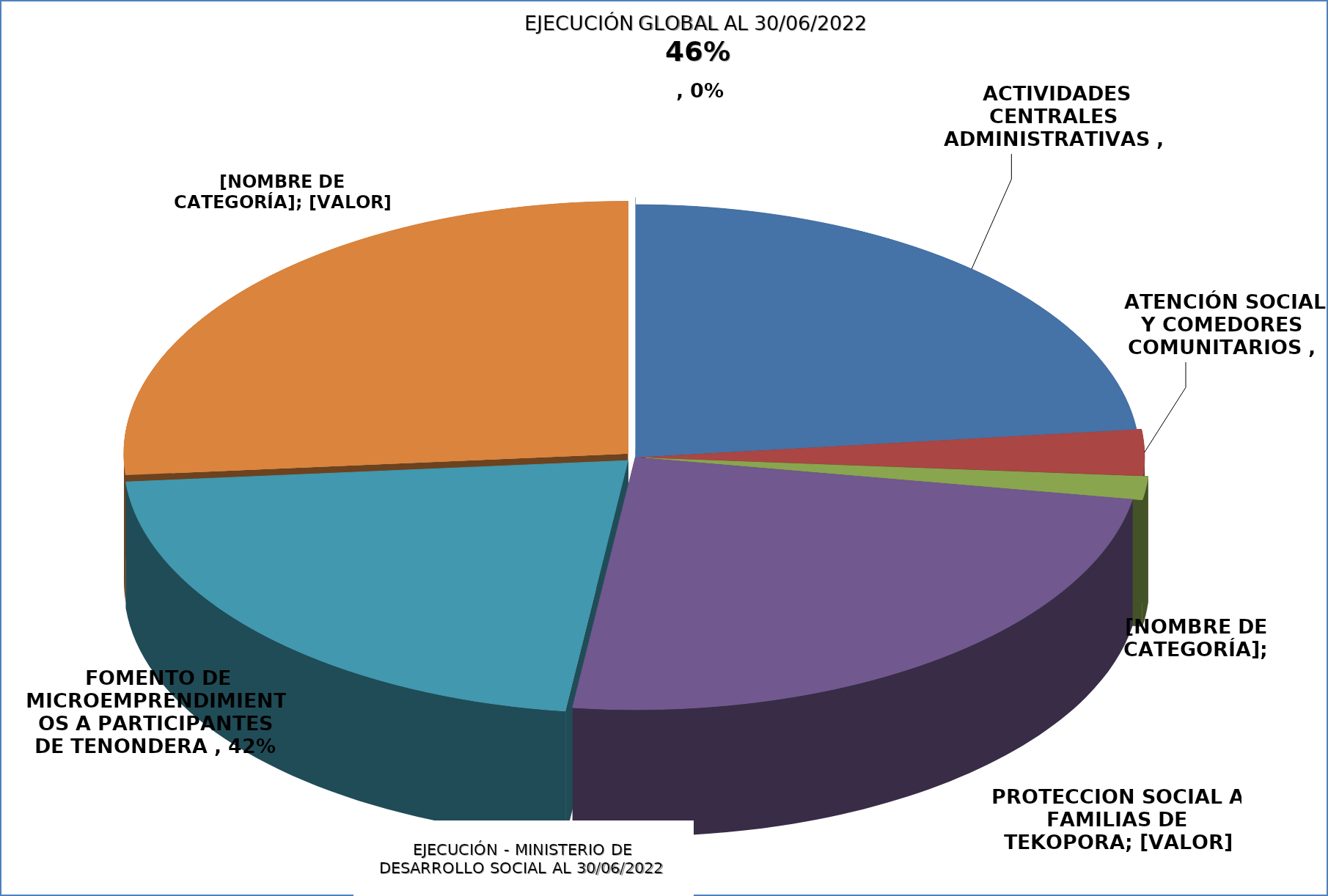
| Category | EJECUCIÓN - MINISTERIO DE DESARROLLO SOCIAL |
|---|---|
| ACTIVIDADES CENTRALES ADMINISTRATIVAS | 0.451 |
| ATENCIÓN SOCIAL Y COMEDORES COMUNITARIOS | 0.057 |
| ASISTENCIA A PESCADORES POR VEDA PESQUERA | 0.029 |
| PROTECCIÓN SOCIAL A FAMILIAS DE TEKOPORA  | 0.472 |
| FOMENTO DE MICROEMPRENDIMIENTOS A PARTICIPANTES DE TENONDERA | 0.421 |
| REGULARIZACIÓN DE TERRITORIOS SOCIALES, TEKOHA | 0.512 |